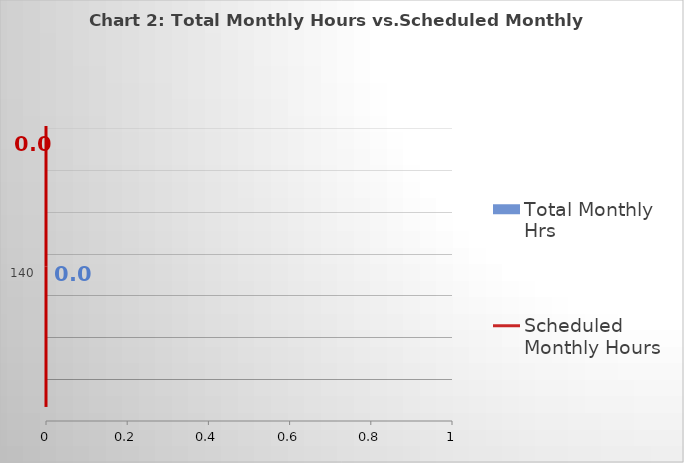
| Category | Total Monthly Hrs |
|---|---|
| 0 | 0 |